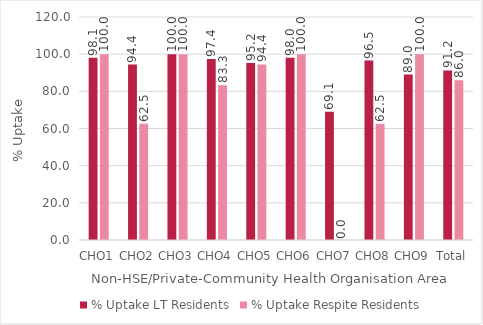
| Category | % Uptake LT Residents | % Uptake Respite Residents |
|---|---|---|
| CHO1 | 98.113 | 100 |
| CHO2 | 94.406 | 62.5 |
| CHO3 | 100 | 100 |
| CHO4 | 97.394 | 83.333 |
| CHO5 | 95.2 | 94.444 |
| CHO6 | 98.045 | 100 |
| CHO7 | 69.053 | 0 |
| CHO8 | 96.53 | 62.5 |
| CHO9 | 89.034 | 100 |
| Total | 91.248 | 85.987 |